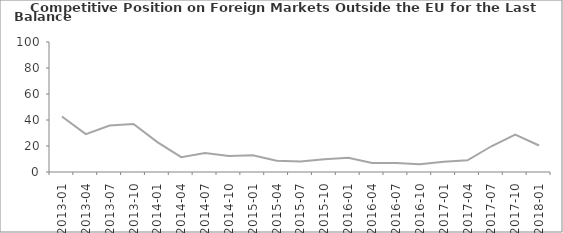
| Category | Balance |
|---|---|
| 2013-01 | 42.7 |
| 2013-04 | 29.1 |
| 2013-07 | 35.8 |
| 2013-10 | 36.9 |
| 2014-01 | 23 |
| 2014-04 | 11.4 |
| 2014-07 | 14.6 |
| 2014-10 | 12.4 |
| 2015-01 | 12.9 |
| 2015-04 | 8.6 |
| 2015-07 | 8.1 |
| 2015-10 | 9.9 |
| 2016-01 | 11 |
| 2016-04 | 7 |
| 2016-07 | 6.9 |
| 2016-10 | 6 |
| 2017-01 | 7.8 |
| 2017-04 | 9 |
| 2017-07 | 19.8 |
| 2017-10 | 28.8 |
| 2018-01 | 20.4 |